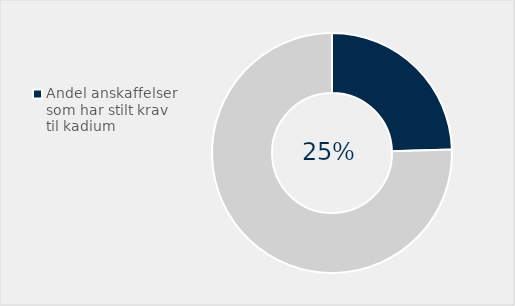
| Category | Series 0 |
|---|---|
| Andel anskaffelser som har stilt krav til kadium | 0.245 |
| Ikke stilt krav | 0.755 |